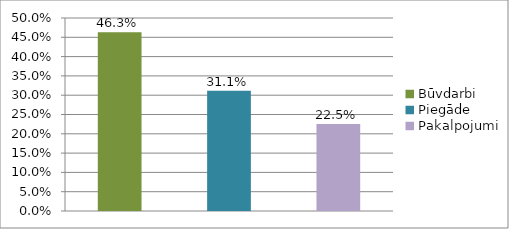
| Category | Series 0 |
|---|---|
| Būvdarbi | 0.463 |
| Piegāde | 0.311 |
| Pakalpojumi | 0.225 |